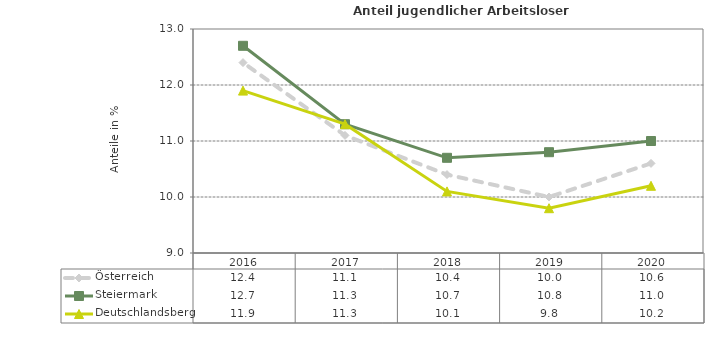
| Category | Österreich | Steiermark | Deutschlandsberg |
|---|---|---|---|
| 2020.0 | 10.6 | 11 | 10.2 |
| 2019.0 | 10 | 10.8 | 9.8 |
| 2018.0 | 10.4 | 10.7 | 10.1 |
| 2017.0 | 11.1 | 11.3 | 11.3 |
| 2016.0 | 12.4 | 12.7 | 11.9 |